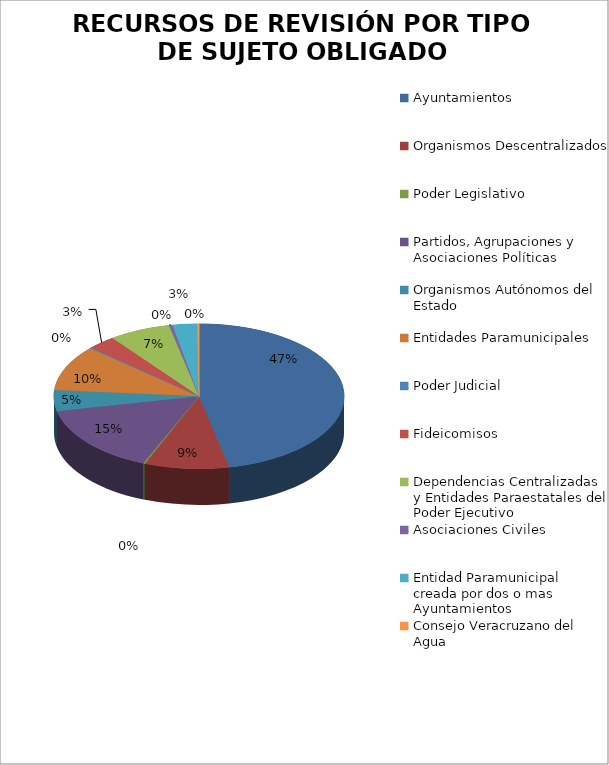
| Category | Series 0 |
|---|---|
| Ayuntamientos | 239 |
| Organismos Descentralizados | 48 |
| Poder Legislativo | 1 |
| Partidos, Agrupaciones y Asociaciones Políticas | 79 |
| Organismos Autónomos del Estado | 24 |
| Entidades Paramunicipales | 52 |
| Poder Judicial | 1 |
| Fideicomisos | 16 |
| Dependencias Centralizadas y Entidades Paraestatales del Poder Ejecutivo | 35 |
| Asociaciones Civiles | 2 |
| Entidad Paramunicipal creada por dos o mas Ayuntamientos | 14 |
| Consejo Veracruzano del Agua | 1 |